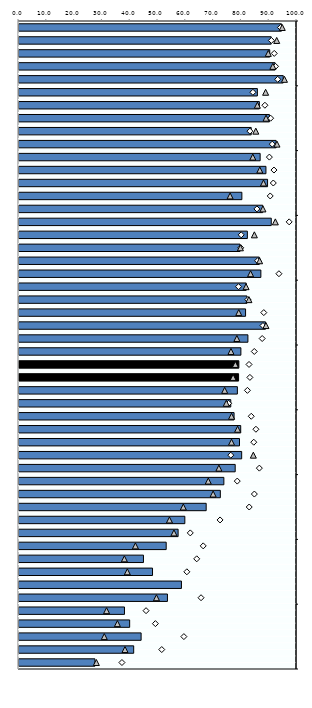
| Category | 25-64 |
|---|---|
| 0 | 94.407 |
| 1 | 90.714 |
| 2 | 90.198 |
| 3 | 92.111 |
| 4 | 95.053 |
| 5 | 85.75 |
| 6 | 86.461 |
| 7 | 90.07 |
| 8 | 83.529 |
| 9 | 92.486 |
| 10 | 86.746 |
| 11 | 88.831 |
| 12 | 89.414 |
| 13 | 80.168 |
| 14 | 87.669 |
| 15 | 90.748 |
| 16 | 82.148 |
| 17 | 79.499 |
| 18 | 86.43 |
| 19 | 87 |
| 20 | 81.727 |
| 21 | 82 |
| 22 | 81.5 |
| 23 | 88.662 |
| 24 | 82.345 |
| 25 | 79.816 |
| 26 | 79.087 |
| 27 | 78.99 |
| 28 | 78.557 |
| 29 | 76.176 |
| 30 | 77.364 |
| 31 | 79.752 |
| 32 | 79.321 |
| 33 | 80.1 |
| 34 | 77.768 |
| 35 | 73.694 |
| 36 | 72.422 |
| 37 | 67.333 |
| 38 | 59.656 |
| 39 | 57.237 |
| 40 | 52.951 |
| 41 | 44.769 |
| 42 | 48.033 |
| 43 | 58.435 |
| 44 | 53.4 |
| 45 | 37.941 |
| 46 | 39.807 |
| 47 | 43.929 |
| 48 | 41.26 |
| 49 | 27.316 |